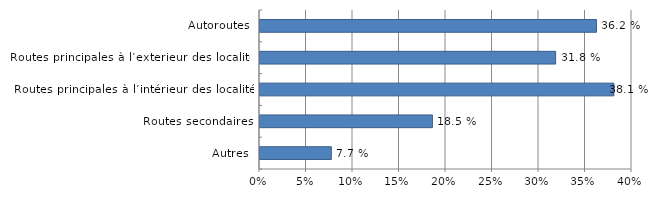
| Category | Oui |
|---|---|
| Autoroutes | 36.181 |
| Routes principales à l’exterieur des localités | 31.788 |
| Routes principales à l’intérieur des localités | 38.055 |
| Routes secondaires | 18.539 |
| Autres | 7.673 |